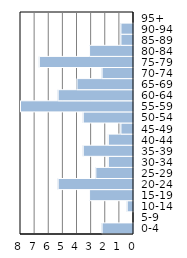
| Category | Series 0 |
|---|---|
| 0-4 | 2.222 |
| 5-9 | 0 |
| 10-14 | 0.444 |
| 15-19 | 3.111 |
| 20-24 | 5.333 |
| 25-29 | 2.667 |
| 30-34 | 1.778 |
| 35-39 | 3.556 |
| 40-44 | 1.778 |
| 45-49 | 0.889 |
| 50-54 | 3.556 |
| 55-59 | 8 |
| 60-64 | 5.333 |
| 65-69 | 4 |
| 70-74 | 2.222 |
| 75-79 | 6.667 |
| 80-84 | 3.111 |
| 85-89 | 0.889 |
| 90-94 | 0.889 |
| 95+ | 0 |